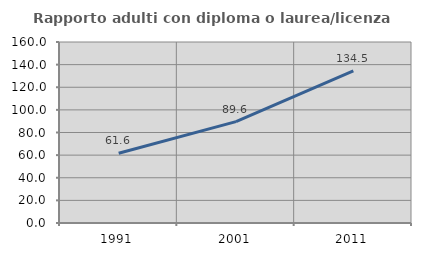
| Category | Rapporto adulti con diploma o laurea/licenza media  |
|---|---|
| 1991.0 | 61.607 |
| 2001.0 | 89.613 |
| 2011.0 | 134.499 |